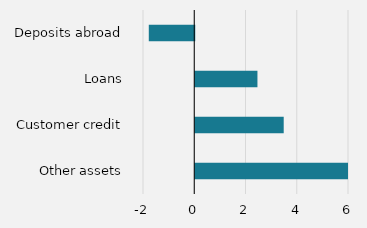
| Category | Series 0 |
|---|---|
| Other assets | 6010 |
| Customer credit | 3452 |
| Loans | 2427 |
| Deposits abroad | -1774 |